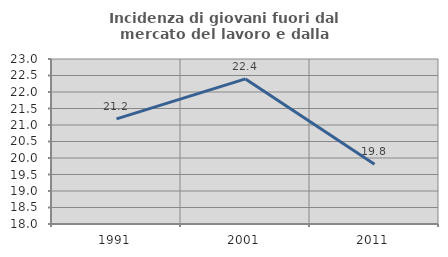
| Category | Incidenza di giovani fuori dal mercato del lavoro e dalla formazione  |
|---|---|
| 1991.0 | 21.185 |
| 2001.0 | 22.396 |
| 2011.0 | 19.808 |